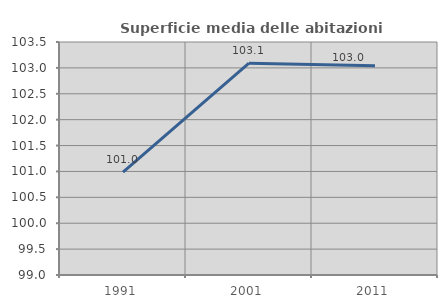
| Category | Superficie media delle abitazioni occupate |
|---|---|
| 1991.0 | 100.985 |
| 2001.0 | 103.091 |
| 2011.0 | 103.043 |